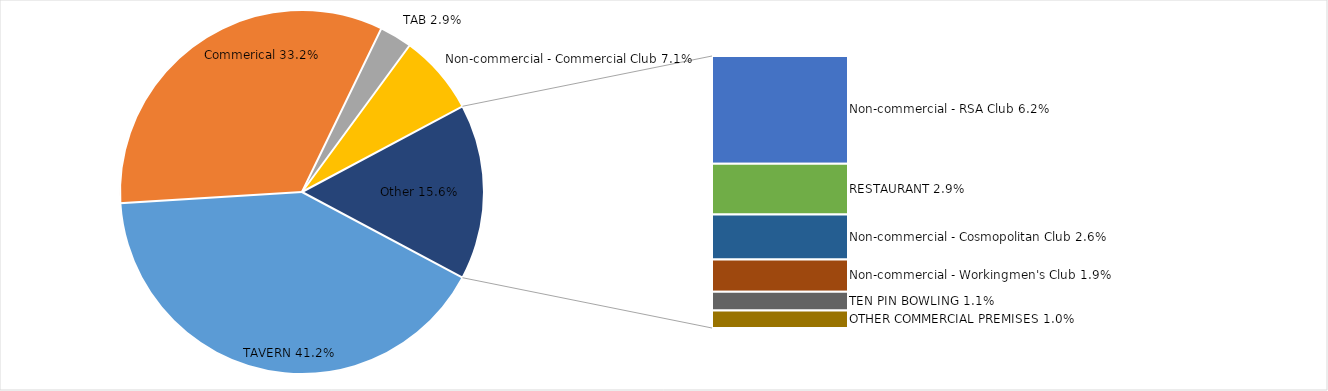
| Category | Number of EGMs | Number of venues | Total GMP | Average per venue |
|---|---|---|---|---|
| TAVERN | 6538 | 460 | 99724637.48 | 216792.69 |
| Commerical | 5263 | 416 | 65705884.27 | 157946.837 |
| TAB | 458 | 40 | 8621092.17 | 215527.304 |
| Non-commercial - Commercial Club | 1129 | 91 | 8076360.02 | 88751.209 |
| Non-commercial - RSA Club | 982 | 75 | 6804215.11 | 90722.868 |
| RESTAURANT | 462 | 35 | 6728896.18 | 192254.177 |
| Non-commercial - Cosmopolitan Club | 409 | 26 | 4152193.65 | 159699.756 |
| Non-commercial - Workingmen's Club | 294 | 17 | 3614092.14 | 212593.655 |
| TEN PIN BOWLING | 171 | 12 | 3516125.88 | 293010.49 |
| OTHER COMMERCIAL PREMISES | 159 | 15 | 1856698.25 | 123779.883 |